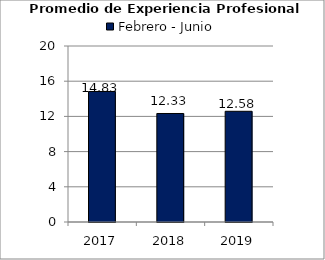
| Category | Febrero - Junio |
|---|---|
| 2017.0 | 14.83 |
| 2018.0 | 12.33 |
| 2019.0 | 12.58 |